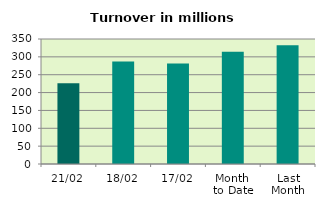
| Category | Series 0 |
|---|---|
| 21/02 | 225.751 |
| 18/02 | 286.888 |
| 17/02 | 281.373 |
| Month 
to Date | 314.233 |
| Last
Month | 332.646 |